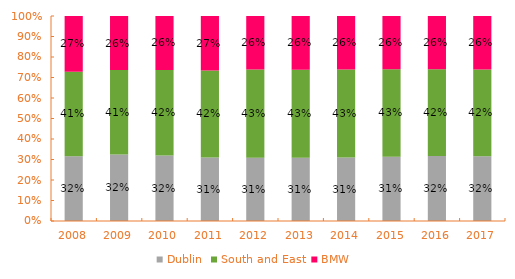
| Category | Dublin | South and East | BMW  |
|---|---|---|---|
| 2008.0 | 0.316 | 0.413 | 0.272 |
| 2009.0 | 0.324 | 0.413 | 0.263 |
| 2010.0 | 0.319 | 0.417 | 0.263 |
| 2011.0 | 0.31 | 0.425 | 0.265 |
| 2012.0 | 0.309 | 0.43 | 0.261 |
| 2013.0 | 0.309 | 0.429 | 0.263 |
| 2014.0 | 0.31 | 0.43 | 0.261 |
| 2015.0 | 0.313 | 0.428 | 0.259 |
| 2016.0 | 0.317 | 0.424 | 0.259 |
| 2017.0 | 0.316 | 0.423 | 0.261 |